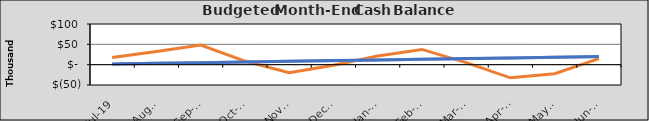
| Category | Final Cash | Original Cash | Revised Cash |
|---|---|---|---|
| 2019-07-01 | 17427.801 | 1640.422 | 1669.173 |
| 2019-08-01 | 32601.672 | 3280.845 | 3338.347 |
| 2019-09-01 | 48347.722 | 4921.267 | 5007.52 |
| 2019-10-02 | 8913.523 | 6561.69 | 6676.693 |
| 2019-11-02 | -19778.676 | 8202.112 | 8345.867 |
| 2019-12-03 | -1230.875 | 9842.535 | 10015.04 |
| 2020-01-03 | 21515.176 | 11482.957 | 11684.213 |
| 2020-02-03 | 37511.226 | 13123.38 | 13353.387 |
| 2020-03-05 | 5011.027 | 14763.802 | 15022.56 |
| 2020-04-05 | -32281.172 | 16404.225 | 16691.733 |
| 2020-05-06 | -22273.371 | 18044.647 | 18360.907 |
| 2020-06-06 | 15025.297 | 19685.07 | 20030.08 |